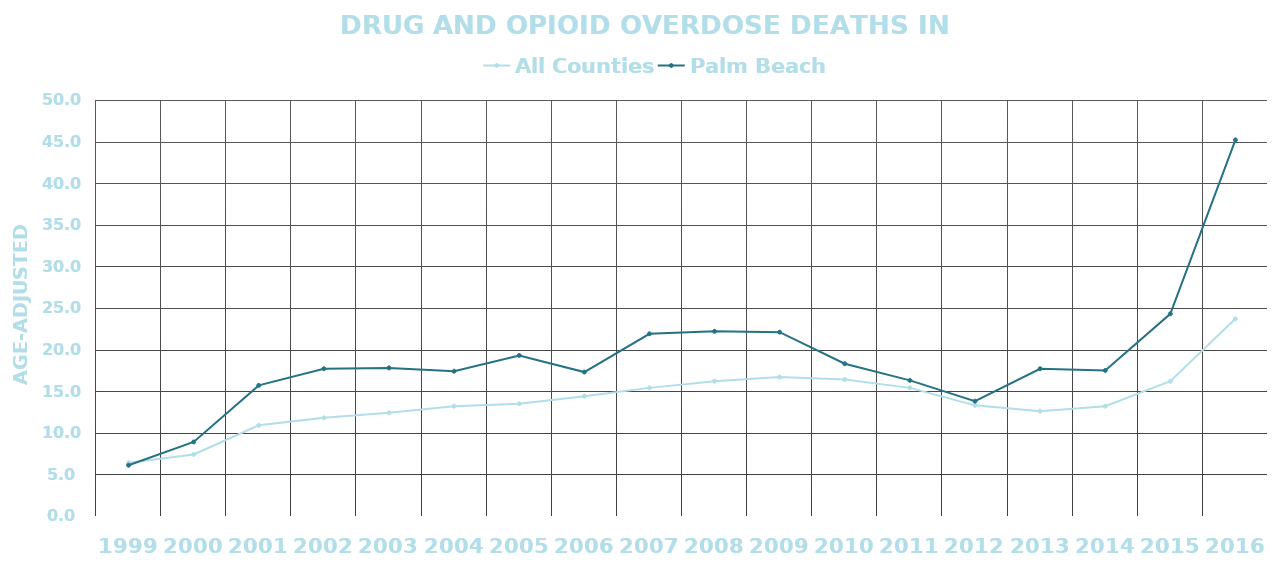
| Category | All Counties | Palm Beach |
|---|---|---|
| 1999.0 | 6.4 | 6.1 |
| 2000.0 | 7.4 | 8.9 |
| 2001.0 | 10.9 | 15.7 |
| 2002.0 | 11.8 | 17.7 |
| 2003.0 | 12.4 | 17.8 |
| 2004.0 | 13.2 | 17.4 |
| 2005.0 | 13.5 | 19.3 |
| 2006.0 | 14.4 | 17.3 |
| 2007.0 | 15.4 | 21.9 |
| 2008.0 | 16.2 | 22.2 |
| 2009.0 | 16.7 | 22.1 |
| 2010.0 | 16.4 | 18.3 |
| 2011.0 | 15.4 | 16.3 |
| 2012.0 | 13.3 | 13.8 |
| 2013.0 | 12.6 | 17.7 |
| 2014.0 | 13.2 | 17.5 |
| 2015.0 | 16.2 | 24.3 |
| 2016.0 | 23.7 | 45.2 |